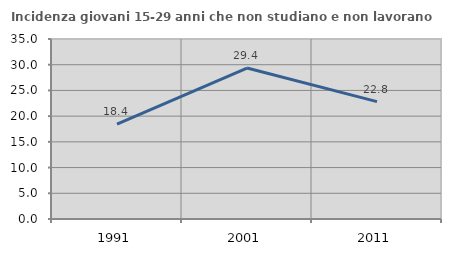
| Category | Incidenza giovani 15-29 anni che non studiano e non lavorano  |
|---|---|
| 1991.0 | 18.435 |
| 2001.0 | 29.353 |
| 2011.0 | 22.831 |